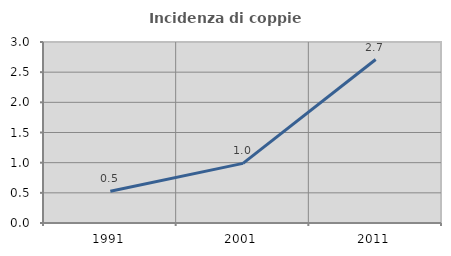
| Category | Incidenza di coppie miste |
|---|---|
| 1991.0 | 0.528 |
| 2001.0 | 0.988 |
| 2011.0 | 2.709 |